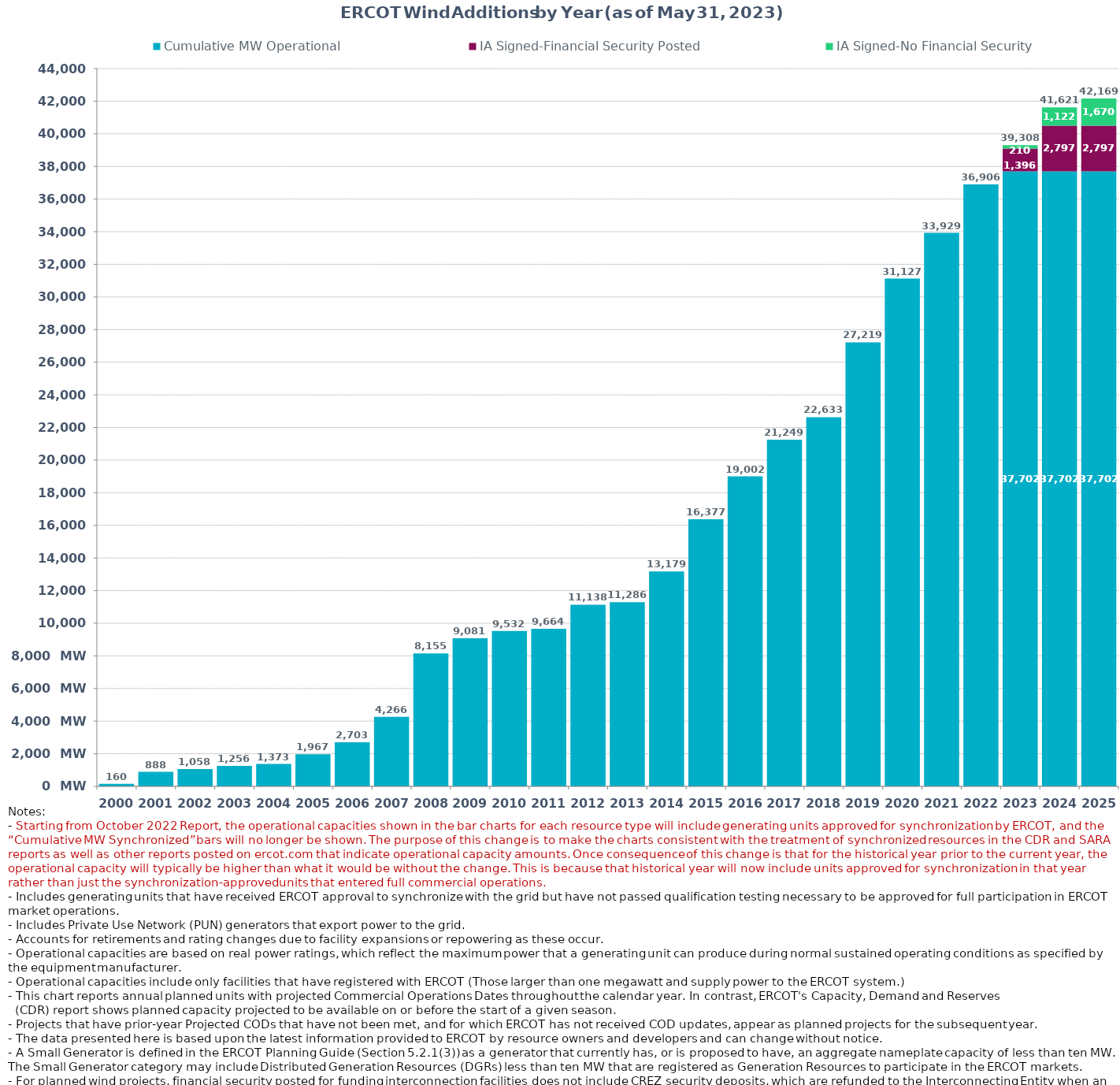
| Category | Cumulative MW Operational  | IA Signed-Financial Security Posted  | IA Signed-No Financial Security  | Other Planned | Cumulative Installed and Planned |
|---|---|---|---|---|---|
| 2000.0 | 160.37 | 0 | 0 | 0 | 160.37 |
| 2001.0 | 887.97 | 0 | 0 | 0 | 887.97 |
| 2002.0 | 1058.22 | 0 | 0 | 0 | 1058.22 |
| 2003.0 | 1255.72 | 0 | 0 | 0 | 1255.72 |
| 2004.0 | 1372.82 | 0 | 0 | 0 | 1372.82 |
| 2005.0 | 1967.04 | 0 | 0 | 0 | 1967.04 |
| 2006.0 | 2703.34 | 0 | 0 | 0 | 2703.34 |
| 2007.0 | 4266.36 | 0 | 0 | 0 | 4266.36 |
| 2008.0 | 8154.76 | 0 | 0 | 0 | 8154.76 |
| 2009.0 | 9080.78 | 0 | 0 | 0 | 9080.78 |
| 2010.0 | 9531.7 | 0 | 0 | 0 | 9531.7 |
| 2011.0 | 9663.7 | 0 | 0 | 0 | 9663.7 |
| 2012.0 | 11137.66 | 0 | 0 | 0 | 11137.66 |
| 2013.0 | 11286.26 | 0 | 0 | 0 | 11286.26 |
| 2014.0 | 13178.84 | 0 | 0 | 0 | 13178.84 |
| 2015.0 | 16376.53 | 0 | 0 | 0 | 16376.53 |
| 2016.0 | 19001.85 | 0 | 0 | 0 | 19001.85 |
| 2017.0 | 21248.99 | 0 | 0 | 0 | 21248.99 |
| 2018.0 | 22632.69 | 0 | 0 | 0 | 22632.69 |
| 2019.0 | 27219.34 | 0 | 0 | 0 | 27219.34 |
| 2020.0 | 31127.31 | 0 | 0 | 0 | 31127.31 |
| 2021.0 | 33928.91 | 0 | 0 | 0 | 33928.91 |
| 2022.0 | 36906.07 | 0 | 0 | 0 | 36906.07 |
| 2023.0 | 37702.33 | 1396.14 | 210 | 0 | 39308.47 |
| 2024.0 | 37702.33 | 2797.4 | 1121.6 | 0 | 41621.33 |
| 2025.0 | 37702.33 | 2797.4 | 1669.61 | 0 | 42169.34 |